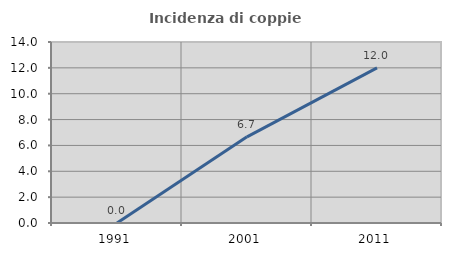
| Category | Incidenza di coppie miste |
|---|---|
| 1991.0 | 0 |
| 2001.0 | 6.667 |
| 2011.0 | 12 |